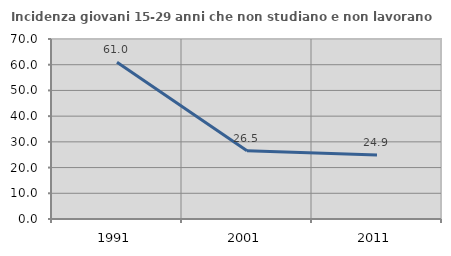
| Category | Incidenza giovani 15-29 anni che non studiano e non lavorano  |
|---|---|
| 1991.0 | 60.995 |
| 2001.0 | 26.531 |
| 2011.0 | 24.889 |